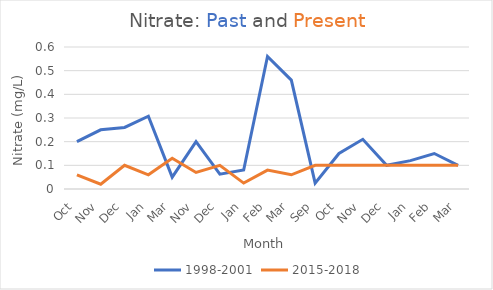
| Category | 1998-2001 | 2015-2018 |
|---|---|---|
| Oct | 0.2 | 0.06 |
| Nov | 0.25 | 0.02 |
| Dec | 0.26 | 0.1 |
| Jan | 0.308 | 0.06 |
| Mar | 0.05 | 0.13 |
| Nov | 0.2 | 0.07 |
| Dec | 0.062 | 0.1 |
| Jan | 0.08 | 0.025 |
| Feb | 0.56 | 0.08 |
| Mar | 0.46 | 0.06 |
| Sep | 0.025 | 0.1 |
| Oct | 0.15 | 0.1 |
| Nov | 0.21 | 0.1 |
| Dec | 0.1 | 0.1 |
| Jan | 0.12 | 0.1 |
| Feb | 0.15 | 0.1 |
| Mar | 0.1 | 0.1 |